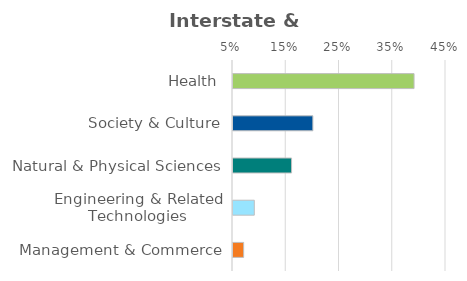
| Category | Series 0 |
|---|---|
| Health | 0.39 |
| Society & Culture | 0.2 |
| Natural & Physical Sciences | 0.16 |
| Engineering & Related Technologies | 0.09 |
| Management & Commerce | 0.07 |